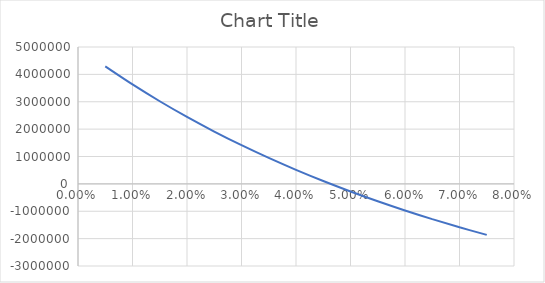
| Category | Series 0 |
|---|---|
| 0.005 | 4291193.403 |
| 0.01 | 3631887.076 |
| 0.015 | 3018047.15 |
| 0.02 | 2446003.341 |
| 0.025 | 1912413.6 |
| 0.03 | 1414232.402 |
| 0.035 | 948682.311 |
| 0.04 | 513228.441 |
| 0.045 | 105555.516 |
| 0.05 | -276452.76 |
| 0.055 | -634732.261 |
| 0.06 | -971055.147 |
| 0.065 | -1287044.927 |
| 0.07 | -1584190.028 |
| 0.075 | -1863856.049 |